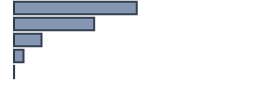
| Category | Percentatge |
|---|---|
| 0 | 51.142 |
| 1 | 33.402 |
| 2 | 11.44 |
| 3 | 3.969 |
| 4 | 0.047 |